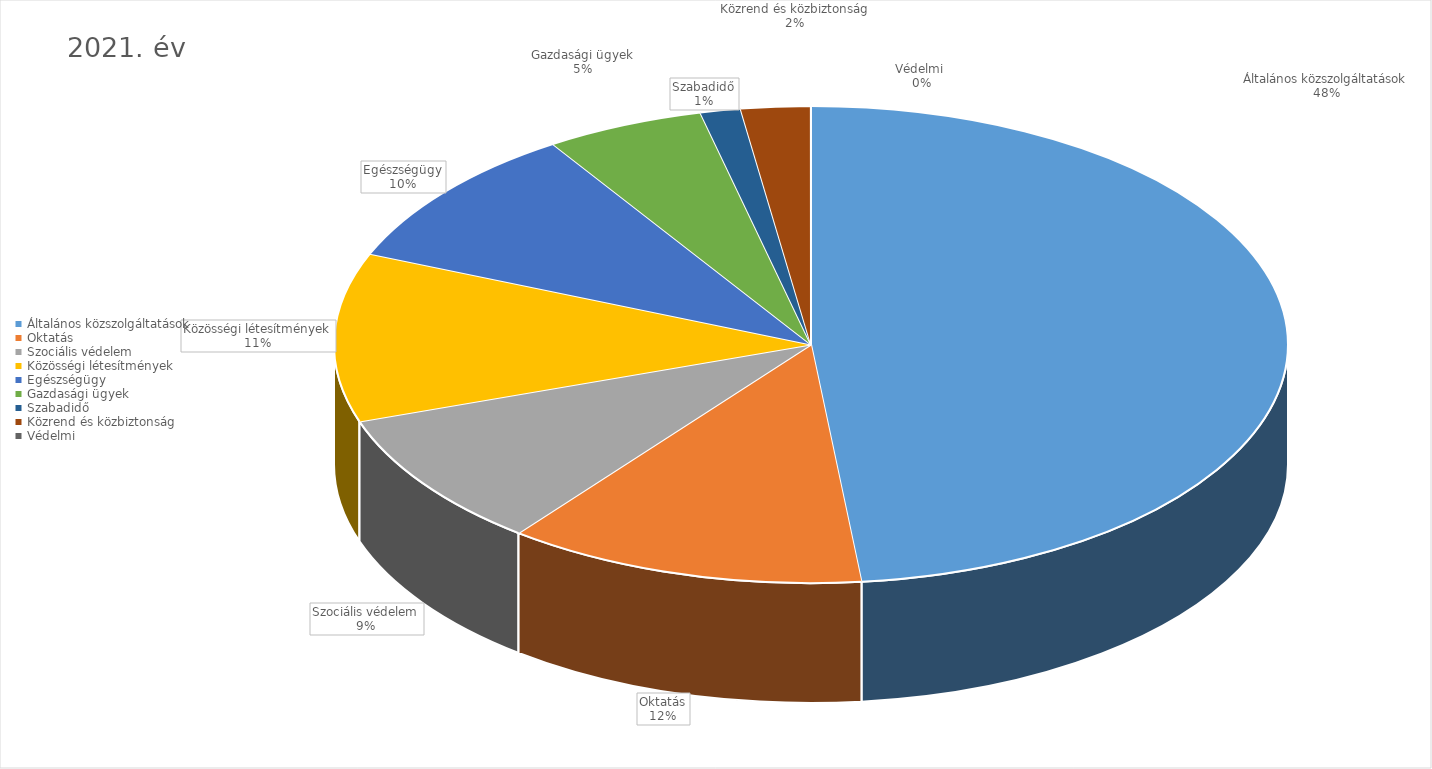
| Category | 2021. év |
|---|---|
| Általános közszolgáltatások | 18651066633 |
| Oktatás | 4704822109 |
| Szociális védelem | 3577072636 |
| Közösségi létesítmények | 4419613500 |
| Egészségügy | 3736015748 |
| Gazdasági ügyek | 2075751558 |
| Szabadidő | 528257580 |
| Közrend és közbiztonság | 909016721 |
| Védelmi  | 1600000 |